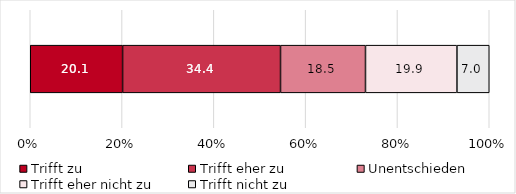
| Category | Trifft zu | Trifft eher zu | Unentschieden | Trifft eher nicht zu | Trifft nicht zu |
|---|---|---|---|---|---|
| 0 | 20.121 | 34.406 | 18.511 | 19.92 | 7.042 |